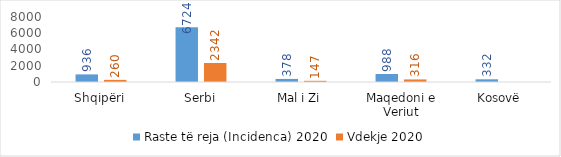
| Category | Raste të reja (Incidenca) 2020 | Vdekje 2020 |
|---|---|---|
| Shqipëri | 936 | 260 |
| Serbi | 6724 | 2342 |
| Mal i Zi | 378 | 147 |
| Maqedoni e Veriut | 988 | 316 |
| Kosovë | 332 | 0 |